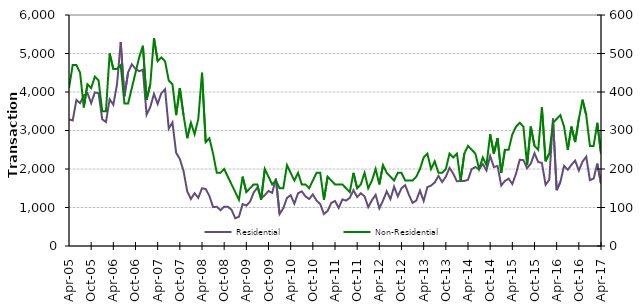
| Category | Residential |
|---|---|
| 2005-04-01 | 3290 |
| 2005-05-01 | 3260 |
| 2005-06-01 | 3790 |
| 2005-07-01 | 3710 |
| 2005-08-01 | 3910 |
| 2005-09-01 | 3970 |
| 2005-10-01 | 3710 |
| 2005-11-01 | 3990 |
| 2005-12-01 | 3970 |
| 2006-01-01 | 3290 |
| 2006-02-01 | 3220 |
| 2006-03-01 | 3810 |
| 2006-04-01 | 3670 |
| 2006-05-01 | 4200 |
| 2006-06-01 | 5300 |
| 2006-07-01 | 3890 |
| 2006-08-01 | 4510 |
| 2006-09-01 | 4720 |
| 2006-10-01 | 4600 |
| 2006-11-01 | 4540 |
| 2006-12-01 | 4580 |
| 2007-01-01 | 3410 |
| 2007-02-01 | 3610 |
| 2007-03-01 | 3950 |
| 2007-04-01 | 3690 |
| 2007-05-01 | 3970 |
| 2007-06-01 | 4070 |
| 2007-07-01 | 3050 |
| 2007-08-01 | 3210 |
| 2007-09-01 | 2420 |
| 2007-10-01 | 2260 |
| 2007-11-01 | 1950 |
| 2007-12-01 | 1420 |
| 2008-01-01 | 1220 |
| 2008-02-01 | 1370 |
| 2008-03-01 | 1250 |
| 2008-04-01 | 1500 |
| 2008-05-01 | 1480 |
| 2008-06-01 | 1300 |
| 2008-07-01 | 1010 |
| 2008-08-01 | 1020 |
| 2008-09-01 | 930 |
| 2008-10-01 | 1020 |
| 2008-11-01 | 1020 |
| 2008-12-01 | 940 |
| 2009-01-01 | 720 |
| 2009-02-01 | 760 |
| 2009-03-01 | 1090 |
| 2009-04-01 | 1050 |
| 2009-05-01 | 1150 |
| 2009-06-01 | 1390 |
| 2009-07-01 | 1520 |
| 2009-08-01 | 1240 |
| 2009-09-01 | 1320 |
| 2009-10-01 | 1430 |
| 2009-11-01 | 1380 |
| 2009-12-01 | 1750 |
| 2010-01-01 | 830 |
| 2010-02-01 | 980 |
| 2010-03-01 | 1250 |
| 2010-04-01 | 1320 |
| 2010-05-01 | 1100 |
| 2010-06-01 | 1370 |
| 2010-07-01 | 1420 |
| 2010-08-01 | 1290 |
| 2010-09-01 | 1220 |
| 2010-10-01 | 1340 |
| 2010-11-01 | 1180 |
| 2010-12-01 | 1090 |
| 2011-01-01 | 830 |
| 2011-02-01 | 910 |
| 2011-03-01 | 1120 |
| 2011-04-01 | 1170 |
| 2011-05-01 | 990 |
| 2011-06-01 | 1210 |
| 2011-07-01 | 1180 |
| 2011-08-01 | 1250 |
| 2011-09-01 | 1450 |
| 2011-10-01 | 1270 |
| 2011-11-01 | 1370 |
| 2011-12-01 | 1290 |
| 2012-01-01 | 1010 |
| 2012-02-01 | 1190 |
| 2012-03-01 | 1330 |
| 2012-04-01 | 980 |
| 2012-05-01 | 1180 |
| 2012-06-01 | 1420 |
| 2012-07-01 | 1220 |
| 2012-08-01 | 1540 |
| 2012-09-01 | 1290 |
| 2012-10-01 | 1500 |
| 2012-11-01 | 1580 |
| 2012-12-01 | 1330 |
| 2013-01-01 | 1120 |
| 2013-02-01 | 1180 |
| 2013-03-01 | 1440 |
| 2013-04-01 | 1170 |
| 2013-05-01 | 1530 |
| 2013-06-01 | 1570 |
| 2013-07-01 | 1650 |
| 2013-08-01 | 1820 |
| 2013-09-01 | 1660 |
| 2013-10-01 | 1800 |
| 2013-11-01 | 2030 |
| 2013-12-01 | 1880 |
| 2014-01-01 | 1680 |
| 2014-02-01 | 1690 |
| 2014-03-01 | 1690 |
| 2014-04-01 | 1720 |
| 2014-05-01 | 2000 |
| 2014-06-01 | 2050 |
| 2014-07-01 | 1990 |
| 2014-08-01 | 2130 |
| 2014-09-01 | 1960 |
| 2014-10-01 | 2340 |
| 2014-11-01 | 2050 |
| 2014-12-01 | 2080 |
| 2015-01-01 | 1570 |
| 2015-02-01 | 1690 |
| 2015-03-01 | 1750 |
| 2015-04-01 | 1610 |
| 2015-05-01 | 1880 |
| 2015-06-01 | 2240 |
| 2015-07-01 | 2230 |
| 2015-08-01 | 2020 |
| 2015-09-01 | 2140 |
| 2015-10-01 | 2410 |
| 2015-11-01 | 2180 |
| 2015-12-01 | 2160 |
| 2016-01-01 | 1590 |
| 2016-02-01 | 1720 |
| 2016-03-01 | 3310 |
| 2016-04-01 | 1450 |
| 2016-05-01 | 1660 |
| 2016-06-01 | 2080 |
| 2016-07-01 | 1980 |
| 2016-08-01 | 2110 |
| 2016-09-01 | 2220 |
| 2016-10-01 | 1960 |
| 2016-11-01 | 2190 |
| 2016-12-01 | 2320 |
| 2017-01-01 | 1710 |
| 2017-02-01 | 1750 |
| 2017-03-01 | 2140 |
| 2017-04-01 | 1620 |